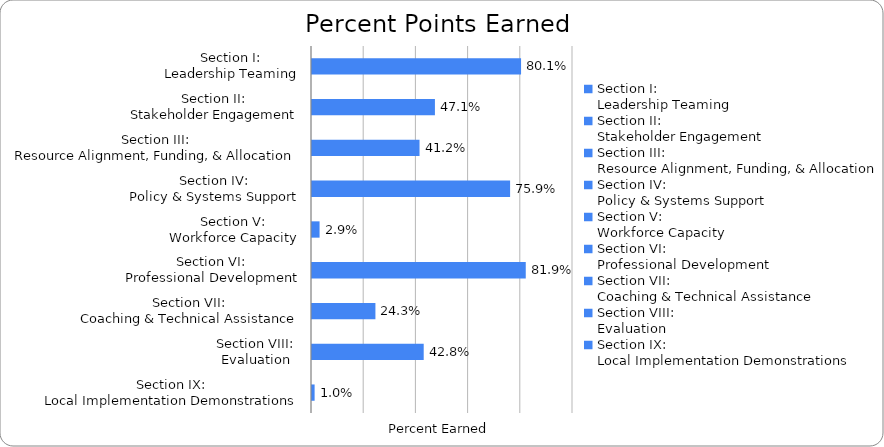
| Category | Percent Earned |
|---|---|
| Section I:
Leadership Teaming | 0.801 |
| Section II:
Stakeholder Engagement | 0.471 |
| Section III:
Resource Alignment, Funding, & Allocation | 0.412 |
| Section IV:
Policy & Systems Support | 0.759 |
| Section V:
Workforce Capacity | 0.029 |
| Section VI:
Professional Development | 0.819 |
| Section VII:
Coaching & Technical Assistance | 0.243 |
| Section VIII:
Evaluation | 0.428 |
| Section IX:
Local Implementation Demonstrations | 0.01 |